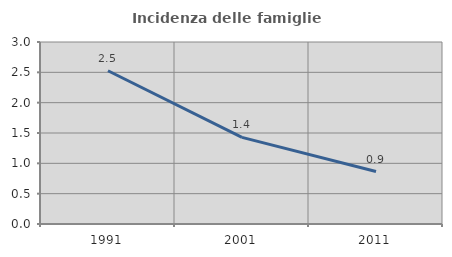
| Category | Incidenza delle famiglie numerose |
|---|---|
| 1991.0 | 2.526 |
| 2001.0 | 1.429 |
| 2011.0 | 0.864 |